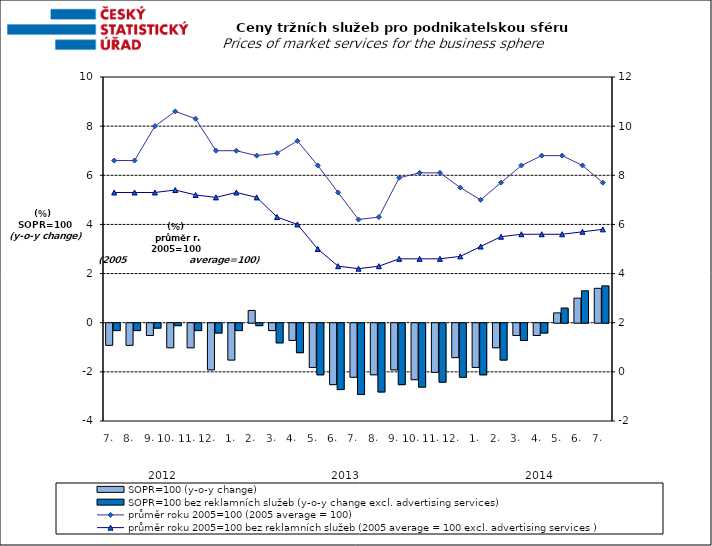
| Category | SOPR=100 (y-o-y change)   | SOPR=100 bez reklamních služeb (y-o-y change excl. advertising services)   |
|---|---|---|
| 0 | -0.9 | -0.3 |
| 1 | -0.9 | -0.3 |
| 2 | -0.5 | -0.2 |
| 3 | -1 | -0.1 |
| 4 | -1 | -0.3 |
| 5 | -1.9 | -0.4 |
| 6 | -1.5 | -0.3 |
| 7 | 0.5 | -0.1 |
| 8 | -0.3 | -0.8 |
| 9 | -0.7 | -1.2 |
| 10 | -1.8 | -2.1 |
| 11 | -2.5 | -2.7 |
| 12 | -2.2 | -2.9 |
| 13 | -2.1 | -2.8 |
| 14 | -1.9 | -2.5 |
| 15 | -2.3 | -2.6 |
| 16 | -2 | -2.4 |
| 17 | -1.4 | -2.2 |
| 18 | -1.8 | -2.1 |
| 19 | -1 | -1.5 |
| 20 | -0.5 | -0.7 |
| 21 | -0.5 | -0.4 |
| 22 | 0.4 | 0.6 |
| 23 | 1 | 1.3 |
| 24 | 1.4 | 1.5 |